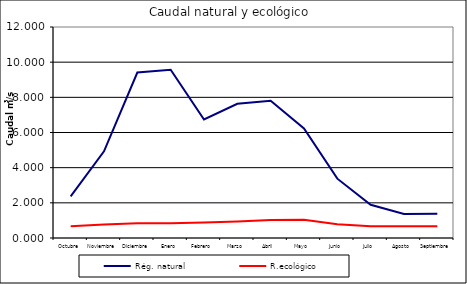
| Category | Rég. natural | R.ecológico |
|---|---|---|
| Octubre | 2.372 | 0.663 |
| Noviembre | 4.93 | 0.767 |
| Diciembre | 9.409 | 0.844 |
| Enero | 9.566 | 0.835 |
| Febrero | 6.743 | 0.881 |
| Marzo | 7.633 | 0.936 |
| Abril | 7.807 | 1.028 |
| Mayo | 6.225 | 1.041 |
| Junio | 3.374 | 0.78 |
| Julio | 1.887 | 0.663 |
| Agosto | 1.367 | 0.663 |
| Septiembre | 1.376 | 0.663 |